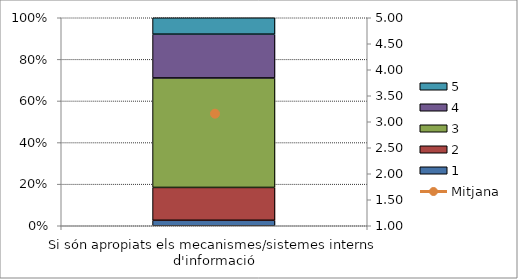
| Category | 1 | 2 | 3 | 4 | 5 |
|---|---|---|---|---|---|
| Si són apropiats els mecanismes/sistemes interns d'informació | 1 | 6 | 20 | 8 | 3 |